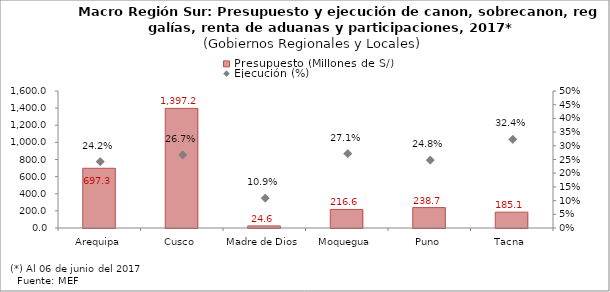
| Category | Presupuesto (Millones de S/) |
|---|---|
| Arequipa | 697.275 |
| Cusco | 1397.242 |
| Madre de Dios | 24.636 |
| Moquegua | 216.6 |
| Puno | 238.66 |
| Tacna | 185.147 |